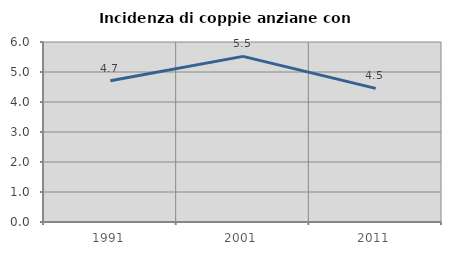
| Category | Incidenza di coppie anziane con figli |
|---|---|
| 1991.0 | 4.706 |
| 2001.0 | 5.521 |
| 2011.0 | 4.455 |